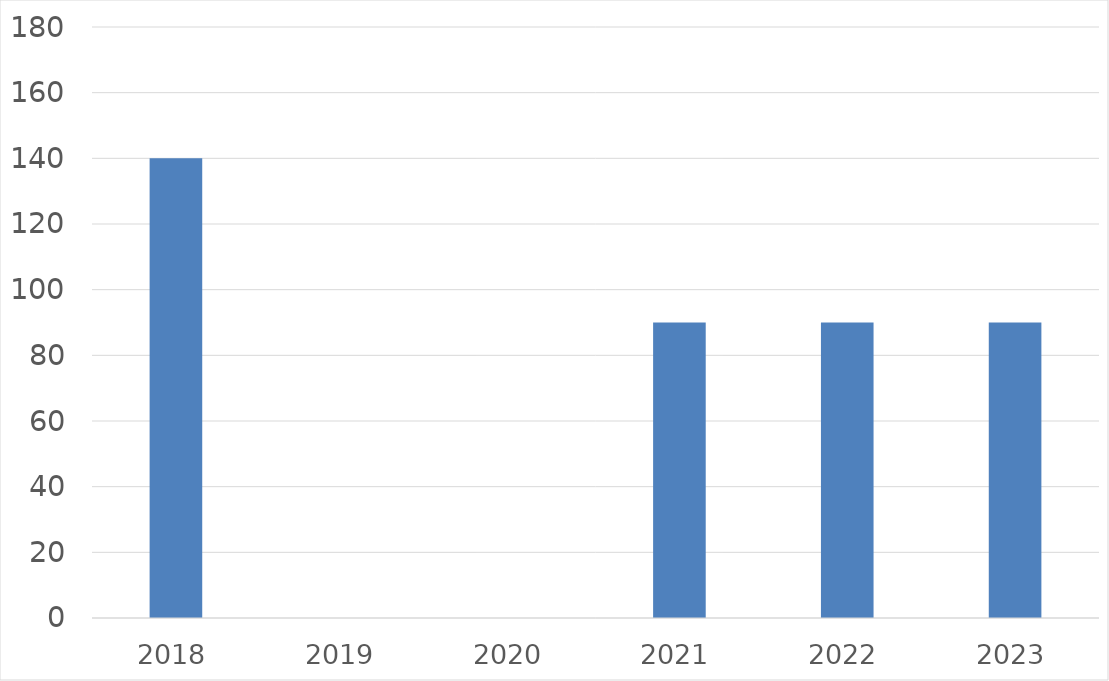
| Category | Series 0 |
|---|---|
| 2018 | 140 |
| 2019 | 0 |
| 2020 | 0 |
| 2021 | 90 |
| 2022 | 90 |
| 2023 | 90 |